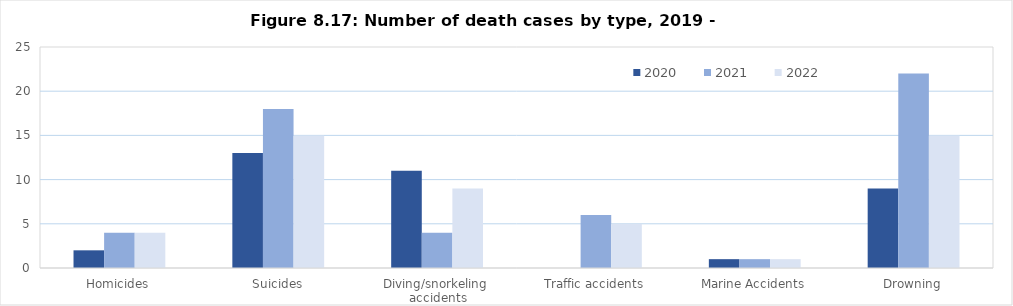
| Category | 2020  | 2021  | 2022 |
|---|---|---|---|
| Homicides | 2 | 4 | 4 |
| Suicides | 13 | 18 | 15 |
| Diving/snorkeling  accidents | 11 | 4 | 9 |
| Traffic accidents | 0 | 6 | 5 |
| Marine Accidents | 1 | 1 | 1 |
| Drowning | 9 | 22 | 15 |